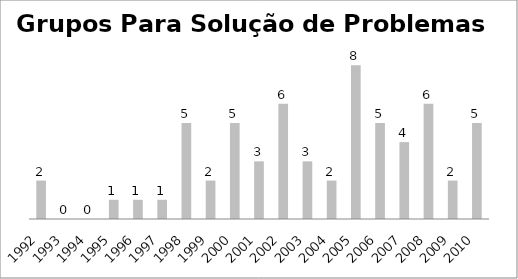
| Category | Grupos Para Solução de Problemas |
|---|---|
| 1992.0 | 2 |
| 1993.0 | 0 |
| 1994.0 | 0 |
| 1995.0 | 1 |
| 1996.0 | 1 |
| 1997.0 | 1 |
| 1998.0 | 5 |
| 1999.0 | 2 |
| 2000.0 | 5 |
| 2001.0 | 3 |
| 2002.0 | 6 |
| 2003.0 | 3 |
| 2004.0 | 2 |
| 2005.0 | 8 |
| 2006.0 | 5 |
| 2007.0 | 4 |
| 2008.0 | 6 |
| 2009.0 | 2 |
| 2010.0 | 5 |